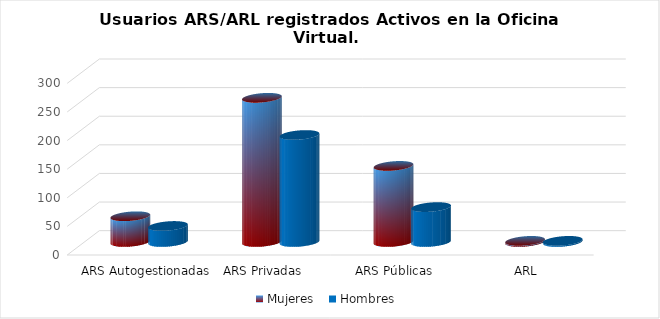
| Category | Mujeres | Hombres |
|---|---|---|
| ARS Autogestionadas | 45 | 28 |
| ARS Privadas | 252 | 187 |
| ARS Públicas | 133 | 61 |
| ARL | 2 | 2 |